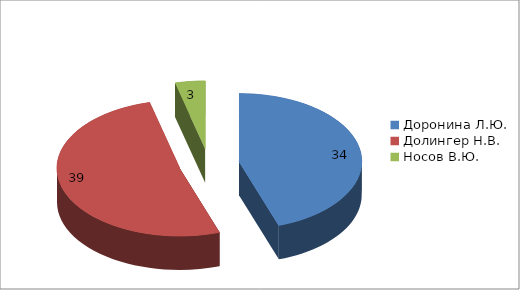
| Category | Series 0 |
|---|---|
| Доронина Л.Ю. | 34 |
| Долингер Н.В. | 39 |
| Носов В.Ю. | 3 |